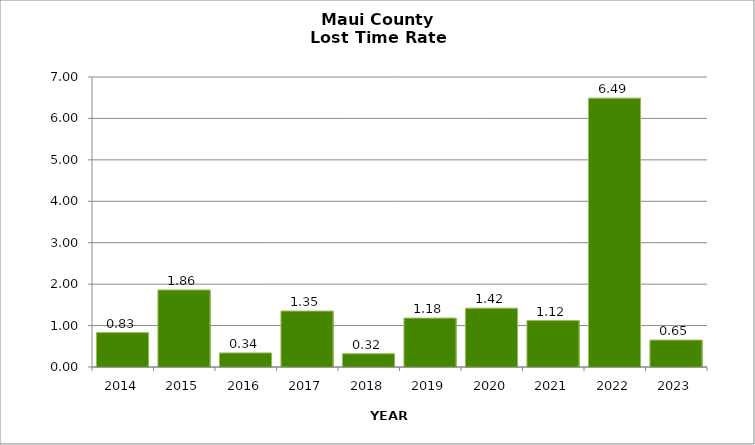
| Category | Maui County |
|---|---|
| 2014.0 | 0.83 |
| 2015.0 | 1.86 |
| 2016.0 | 0.34 |
| 2017.0 | 1.35 |
| 2018.0 | 0.32 |
| 2019.0 | 1.18 |
| 2020.0 | 1.42 |
| 2021.0 | 1.12 |
| 2022.0 | 6.49 |
| 2023.0 | 0.65 |